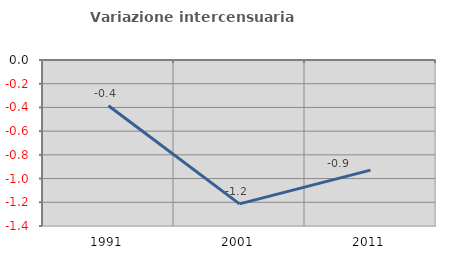
| Category | Variazione intercensuaria annua |
|---|---|
| 1991.0 | -0.386 |
| 2001.0 | -1.214 |
| 2011.0 | -0.928 |